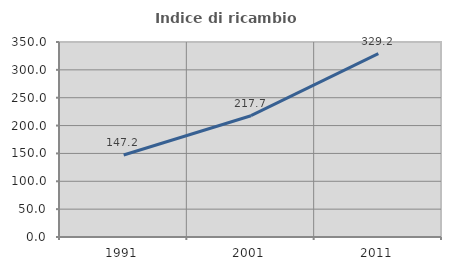
| Category | Indice di ricambio occupazionale  |
|---|---|
| 1991.0 | 147.159 |
| 2001.0 | 217.692 |
| 2011.0 | 329.204 |